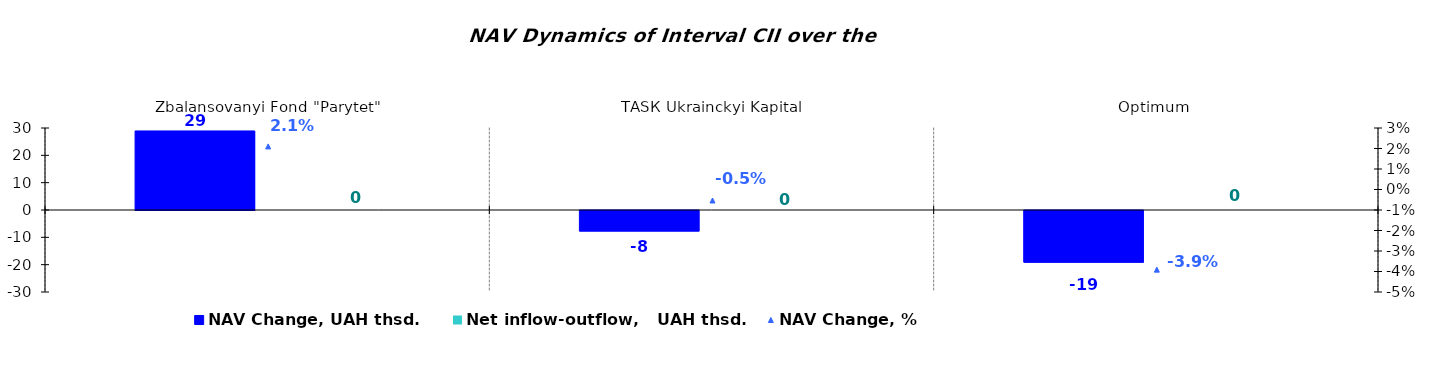
| Category | NAV Change, UAH thsd. | Net inflow-outflow,   UAH thsd. |
|---|---|---|
| Zbalansovanyi Fond "Parytet" | 28.924 | 0 |
| ТАSК Ukrainckyi Kapital | -7.521 | 0 |
| Оptimum | -18.895 | 0 |